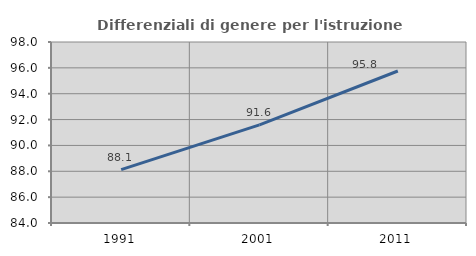
| Category | Differenziali di genere per l'istruzione superiore |
|---|---|
| 1991.0 | 88.127 |
| 2001.0 | 91.594 |
| 2011.0 | 95.756 |